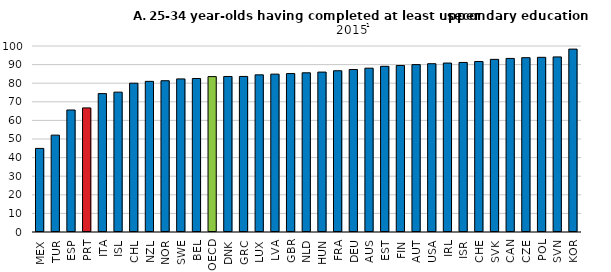
| Category | At least upper secondary |
|---|---|
| MEX | 44.947 |
| TUR | 52.077 |
| ESP | 65.597 |
| PRT | 66.725 |
| ITA | 74.411 |
| ISL | 75.19 |
| CHL | 79.997 |
| NZL | 80.995 |
| NOR | 81.33 |
| SWE | 82.312 |
| BEL | 82.531 |
| OECD | 83.546 |
| DNK | 83.611 |
| GRC | 83.634 |
| LUX | 84.486 |
| LVA | 84.878 |
| GBR | 85.178 |
| NLD | 85.586 |
| HUN | 85.975 |
| FRA | 86.698 |
| DEU | 87.349 |
| AUS | 88.079 |
| EST | 89.079 |
| FIN | 89.535 |
| AUT | 89.993 |
| USA | 90.482 |
| IRL | 90.833 |
| ISR | 91.16 |
| CHE | 91.667 |
| SVK | 92.811 |
| CAN | 93.314 |
| CZE | 93.722 |
| POL | 93.91 |
| SVN | 94.135 |
| KOR | 98.326 |